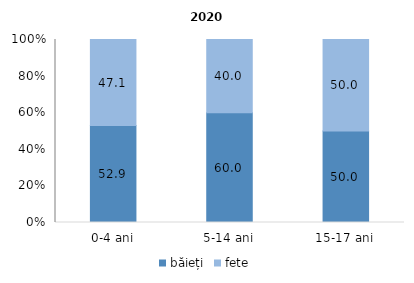
| Category | băieți | fete |
|---|---|---|
| 0-4 ani | 52.941 | 47.059 |
| 5-14 ani | 60 | 40 |
| 15-17 ani | 50 | 50 |